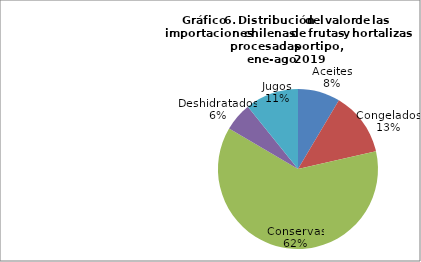
| Category | Series 0 |
|---|---|
| Aceites | 22606282.42 |
| Congelados | 34063220.21 |
| Conservas | 164182948.61 |
| Deshidratados | 15212316.11 |
| Jugos | 28505283.11 |